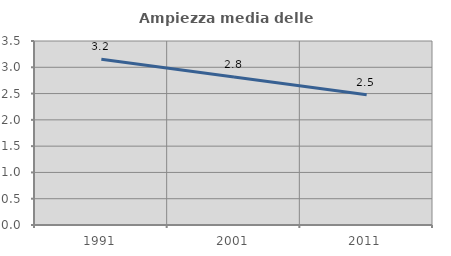
| Category | Ampiezza media delle famiglie |
|---|---|
| 1991.0 | 3.155 |
| 2001.0 | 2.817 |
| 2011.0 | 2.477 |